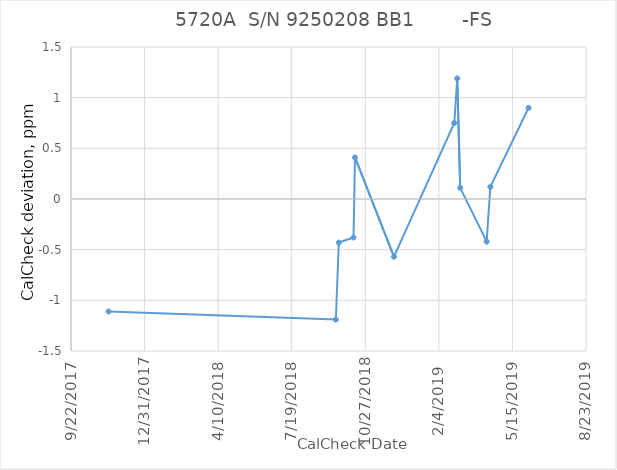
| Category |        -FS |
|---|---|
| 43051.0 | -1.11 |
| 43360.0 | -1.19 |
| 43364.0 | -0.43 |
| 43384.0 | -0.38 |
| 43386.0 | 0.41 |
| 43439.0 | -0.57 |
| 43521.0 | 0.75 |
| 43525.0 | 1.19 |
| 43529.0 | 0.11 |
| 43565.0 | -0.42 |
| 43570.0 | 0.12 |
| 43622.0 | 0.9 |